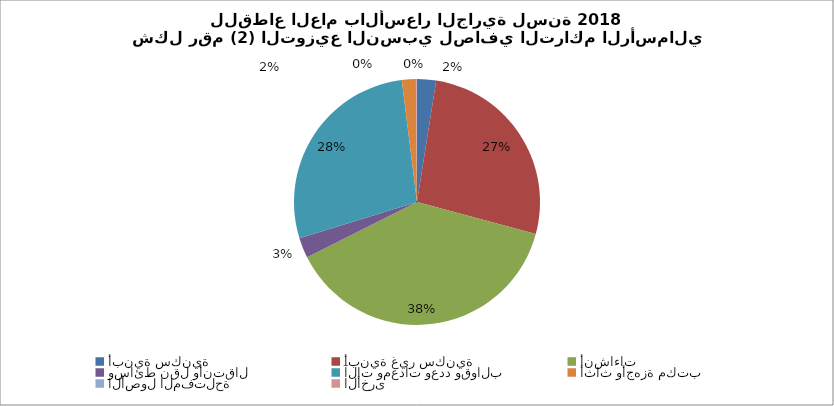
| Category | Series 0 |
|---|---|
| أبنية سكنية | 4742560.792 |
| أبنية غير سكنية | 50682901.401 |
| أنشاءات | 72922790.474 |
| وسائط نقل وأنتقال | 5040404.272 |
| آلات ومعدات وعدد وقوالب | 52729317.566 |
| أثاث وأجهزة مكتب | 3483654.398 |
| الأصول المفتلحة | 107197.911 |
| الأخرى  | 160522.118 |